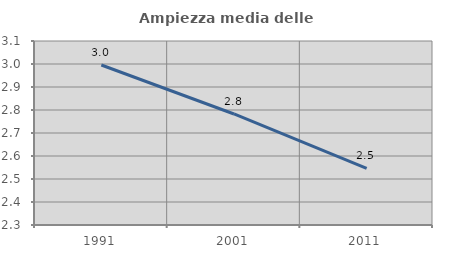
| Category | Ampiezza media delle famiglie |
|---|---|
| 1991.0 | 2.996 |
| 2001.0 | 2.783 |
| 2011.0 | 2.546 |